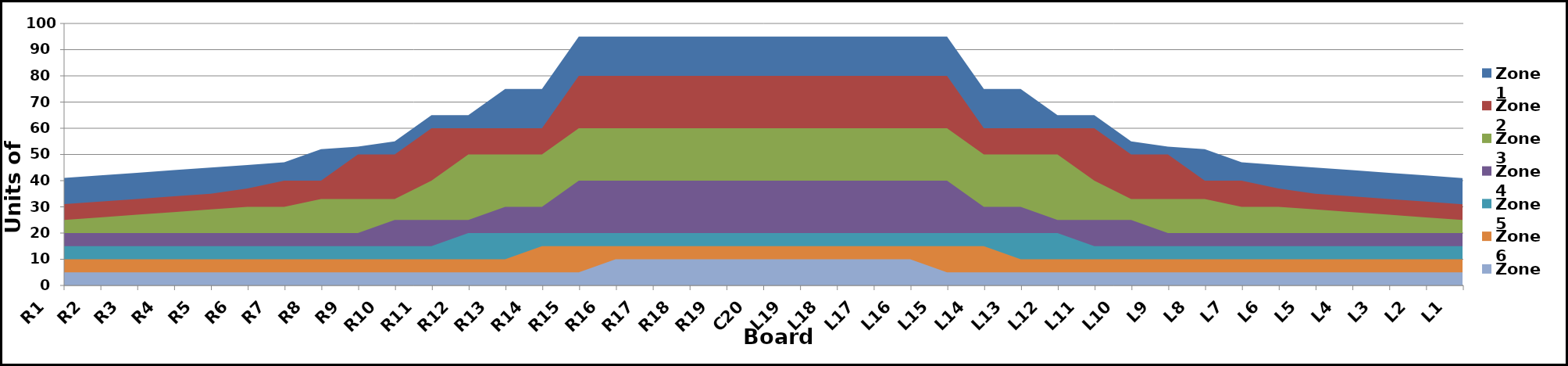
| Category | Zone 1 | Zone 2 | Zone 3 | Zone 4 | Zone 5 | Zone 6 | Zone 7 | Zone 8 |
|---|---|---|---|---|---|---|---|---|
| L1 | 41 | 31 | 25 | 20 | 15 | 10 | 5 | 0 |
| L2 | 42 | 32 | 26 | 20 | 15 | 10 | 5 | 0 |
| L3 | 43 | 33 | 27 | 20 | 15 | 10 | 5 | 0 |
| L4 | 44 | 34 | 28 | 20 | 15 | 10 | 5 | 0 |
| L5 | 45 | 35 | 29 | 20 | 15 | 10 | 5 | 0 |
| L6 | 46 | 37 | 30 | 20 | 15 | 10 | 5 | 0 |
| L7 | 47 | 40 | 30 | 20 | 15 | 10 | 5 | 0 |
| L8 | 52 | 40 | 33 | 20 | 15 | 10 | 5 | 0 |
| L9 | 53 | 50 | 33 | 20 | 15 | 10 | 5 | 0 |
| L10 | 55 | 50 | 33 | 25 | 15 | 10 | 5 | 0 |
| L11 | 65 | 60 | 40 | 25 | 15 | 10 | 5 | 0 |
| L12 | 65 | 60 | 50 | 25 | 20 | 10 | 5 | 0 |
| L13 | 75 | 60 | 50 | 30 | 20 | 10 | 5 | 0 |
| L14 | 75 | 60 | 50 | 30 | 20 | 15 | 5 | 0 |
| L15 | 95 | 80 | 60 | 40 | 20 | 15 | 5 | 0 |
| L16 | 95 | 80 | 60 | 40 | 20 | 15 | 10 | 0 |
| L17 | 95 | 80 | 60 | 40 | 20 | 15 | 10 | 0 |
| L18 | 95 | 80 | 60 | 40 | 20 | 15 | 10 | 0 |
| L19 | 95 | 80 | 60 | 40 | 20 | 15 | 10 | 0 |
| C20 | 95 | 80 | 60 | 40 | 20 | 15 | 10 | 0 |
| R19 | 95 | 80 | 60 | 40 | 20 | 15 | 10 | 0 |
| R18 | 95 | 80 | 60 | 40 | 20 | 15 | 10 | 0 |
| R17 | 95 | 80 | 60 | 40 | 20 | 15 | 10 | 0 |
| R16 | 95 | 80 | 60 | 40 | 20 | 15 | 10 | 0 |
| R15 | 95 | 80 | 60 | 40 | 20 | 15 | 5 | 0 |
| R14 | 75 | 60 | 50 | 30 | 20 | 15 | 5 | 0 |
| R13 | 75 | 60 | 50 | 30 | 20 | 10 | 5 | 0 |
| R12 | 65 | 60 | 50 | 25 | 20 | 10 | 5 | 0 |
| R11 | 65 | 60 | 40 | 25 | 15 | 10 | 5 | 0 |
| R10 | 55 | 50 | 33 | 25 | 15 | 10 | 5 | 0 |
| R9 | 53 | 50 | 33 | 20 | 15 | 10 | 5 | 0 |
| R8 | 52 | 40 | 33 | 20 | 15 | 10 | 5 | 0 |
| R7 | 47 | 40 | 30 | 20 | 15 | 10 | 5 | 0 |
| R6 | 46 | 37 | 30 | 20 | 15 | 10 | 5 | 0 |
| R5 | 45 | 35 | 29 | 20 | 15 | 10 | 5 | 0 |
| R4 | 44 | 34 | 28 | 20 | 15 | 10 | 5 | 0 |
| R3 | 43 | 33 | 27 | 20 | 15 | 10 | 5 | 0 |
| R2 | 42 | 32 | 26 | 20 | 15 | 10 | 5 | 0 |
| R1 | 41 | 31 | 25 | 20 | 15 | 10 | 5 | 0 |